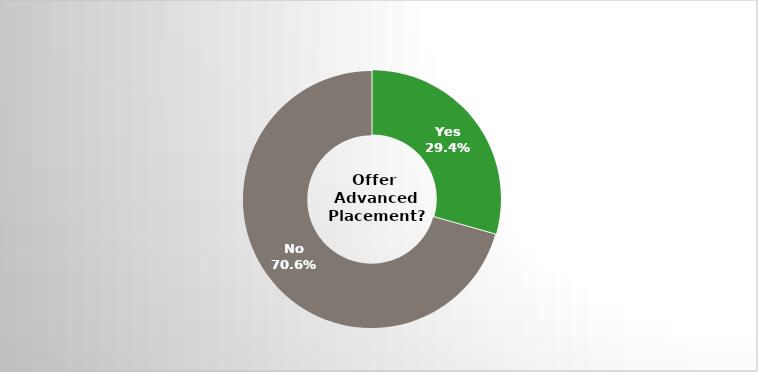
| Category | Series 0 |
|---|---|
| Yes | 0.294 |
| No | 0.706 |